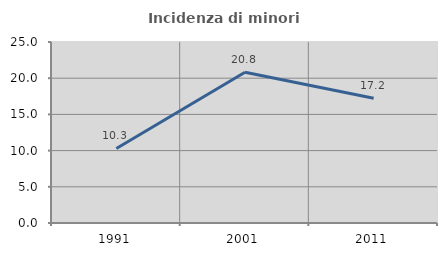
| Category | Incidenza di minori stranieri |
|---|---|
| 1991.0 | 10.294 |
| 2001.0 | 20.833 |
| 2011.0 | 17.232 |